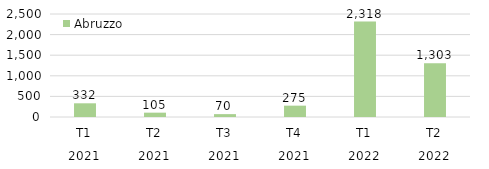
| Category | Abruzzo |
|---|---|
| 0 | 332.478 |
| 1 | 105.385 |
| 2 | 69.533 |
| 3 | 275.12 |
| 4 | 2317.767 |
| 5 | 1302.522 |